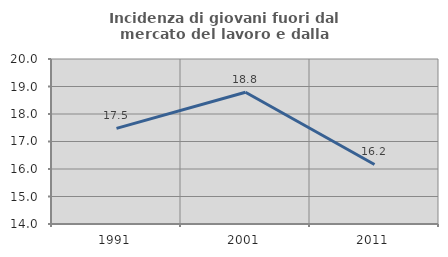
| Category | Incidenza di giovani fuori dal mercato del lavoro e dalla formazione  |
|---|---|
| 1991.0 | 17.479 |
| 2001.0 | 18.79 |
| 2011.0 | 16.164 |